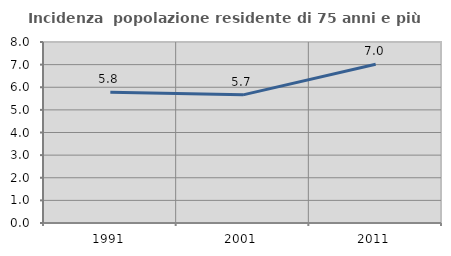
| Category | Incidenza  popolazione residente di 75 anni e più |
|---|---|
| 1991.0 | 5.778 |
| 2001.0 | 5.664 |
| 2011.0 | 7.019 |